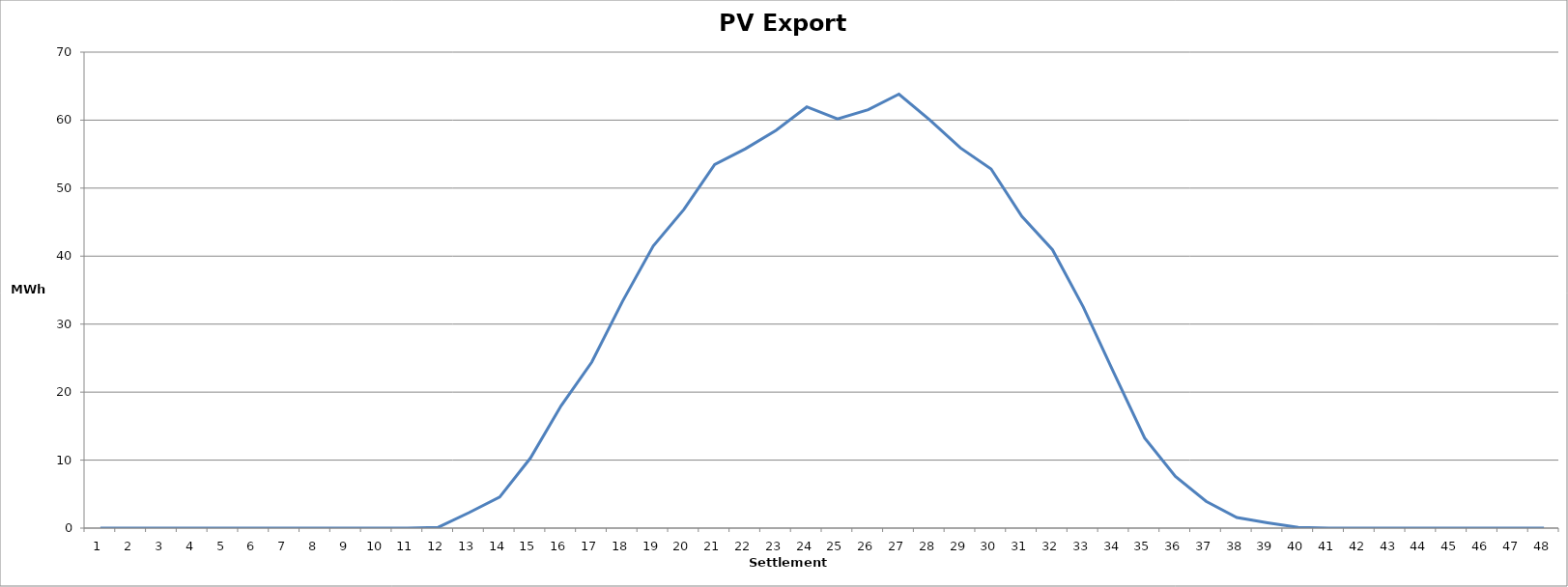
| Category | Series 0 |
|---|---|
| 0 | 0 |
| 1 | 0 |
| 2 | 0 |
| 3 | 0 |
| 4 | 0 |
| 5 | 0 |
| 6 | 0 |
| 7 | 0 |
| 8 | 0 |
| 9 | 0 |
| 10 | 0 |
| 11 | 0.118 |
| 12 | 2.272 |
| 13 | 4.569 |
| 14 | 10.286 |
| 15 | 17.984 |
| 16 | 24.419 |
| 17 | 33.348 |
| 18 | 41.491 |
| 19 | 46.878 |
| 20 | 53.465 |
| 21 | 55.786 |
| 22 | 58.507 |
| 23 | 61.945 |
| 24 | 60.184 |
| 25 | 61.538 |
| 26 | 63.822 |
| 27 | 60.038 |
| 28 | 55.92 |
| 29 | 52.821 |
| 30 | 45.868 |
| 31 | 40.931 |
| 32 | 32.536 |
| 33 | 22.809 |
| 34 | 13.252 |
| 35 | 7.599 |
| 36 | 3.936 |
| 37 | 1.549 |
| 38 | 0.786 |
| 39 | 0.107 |
| 40 | 0 |
| 41 | 0 |
| 42 | 0 |
| 43 | 0 |
| 44 | 0 |
| 45 | 0 |
| 46 | 0 |
| 47 | 0 |